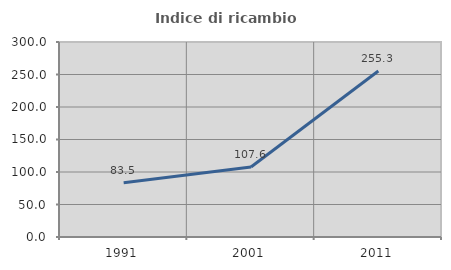
| Category | Indice di ricambio occupazionale  |
|---|---|
| 1991.0 | 83.505 |
| 2001.0 | 107.595 |
| 2011.0 | 255.319 |